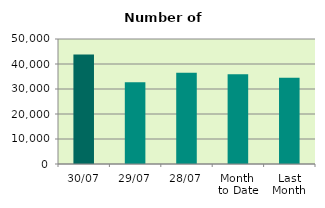
| Category | Series 0 |
|---|---|
| 30/07 | 43808 |
| 29/07 | 32666 |
| 28/07 | 36532 |
| Month 
to Date | 35875.545 |
| Last
Month | 34545 |